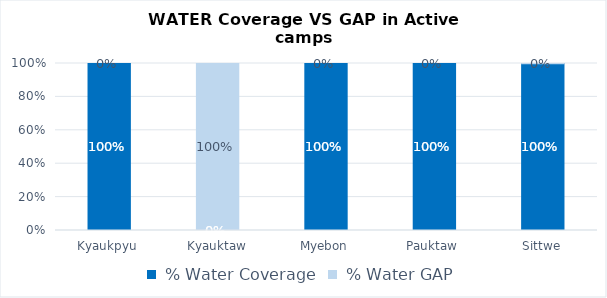
| Category |  % Water Coverage |  % Water GAP |
|---|---|---|
| Kyaukpyu | 1 | 0 |
| Kyauktaw | 0 | 1 |
| Myebon | 1 | 0 |
| Pauktaw | 1 | 0 |
| Sittwe | 0.999 | 0.001 |